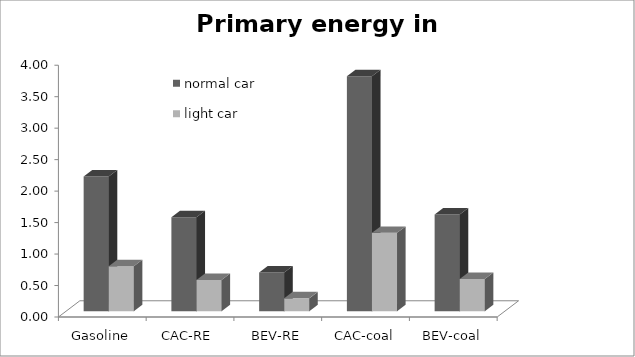
| Category | normal car | light car |
|---|---|---|
| Gasoline | 2.141 | 0.714 |
| CAC-RE  | 1.494 | 0.498 |
| BEV-RE | 0.614 | 0.205 |
| CAC-coal | 3.735 | 1.245 |
| BEV-coal | 1.536 | 0.512 |